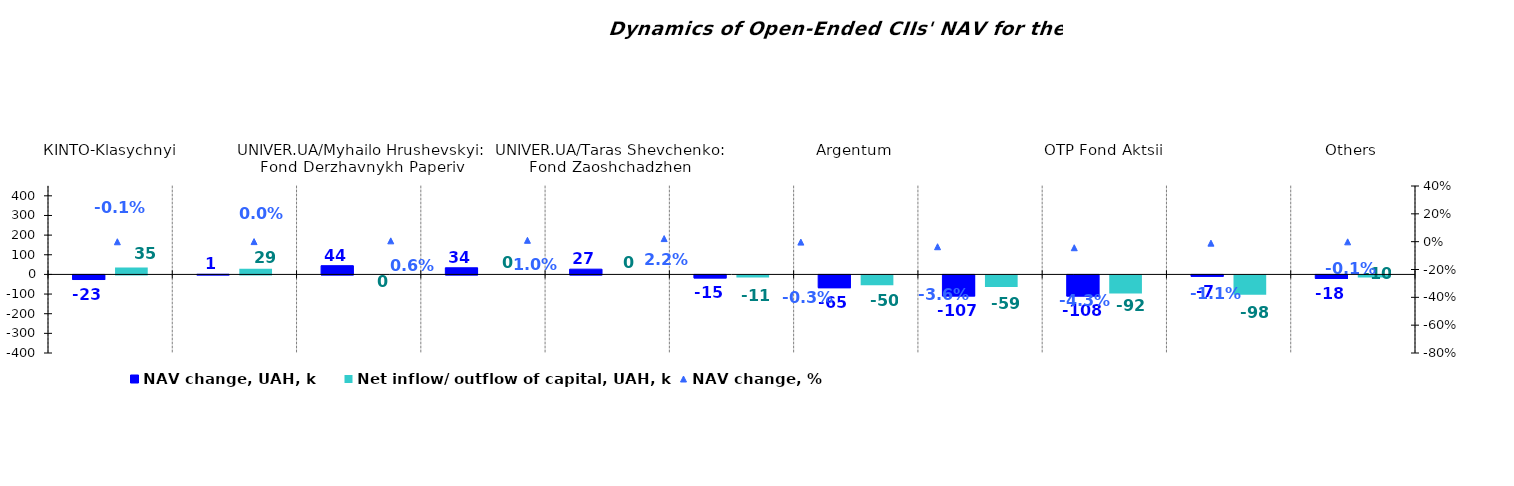
| Category | NAV change, UAH, k | Net inflow/ outflow of capital, UAH, k |
|---|---|---|
| КІNТО-Klasychnyi | -23.486 | 35.341 |
| VSI | 0.773 | 28.546 |
| UNIVER.UA/Myhailo Hrushevskyi: Fond Derzhavnykh Paperiv | 44.442 | 0 |
| Altus – Zbalansovanyi | 33.708 | 0 |
| UNIVER.UA/Taras Shevchenko: Fond Zaoshchadzhen | 26.705 | 0 |
| КІNTO-Ekviti | -15.269 | -10.552 |
| Argentum | -65.004 | -50.004 |
| KINTO-Kaznacheiskyi | -107.228 | -58.792 |
| OTP Fond Aktsii | -107.893 | -91.827 |
| OTP Klasychnyi' | -7.15 | -98.246 |
| Others | -17.84 | -10.162 |